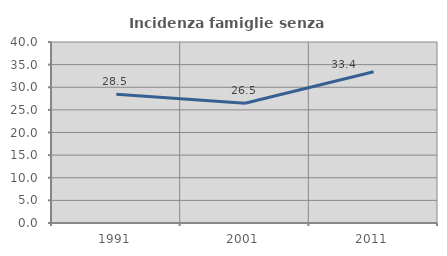
| Category | Incidenza famiglie senza nuclei |
|---|---|
| 1991.0 | 28.455 |
| 2001.0 | 26.471 |
| 2011.0 | 33.439 |